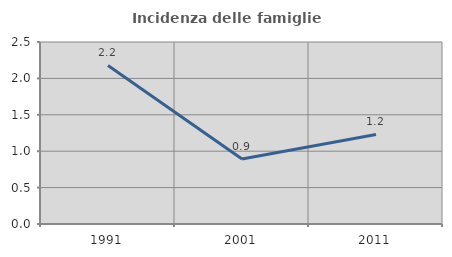
| Category | Incidenza delle famiglie numerose |
|---|---|
| 1991.0 | 2.177 |
| 2001.0 | 0.893 |
| 2011.0 | 1.231 |